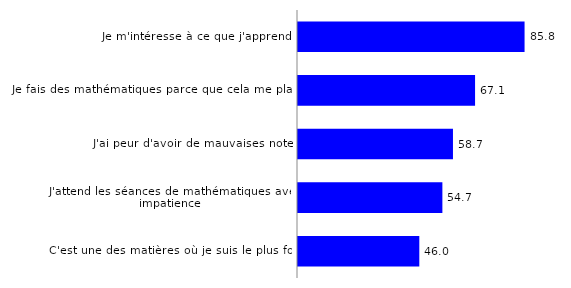
| Category | Series 0 |
|---|---|
| C'est une des matières où je suis le plus fort | 45.95 |
| J'attend les séances de mathématiques avec impatience | 54.69 |
| J'ai peur d'avoir de mauvaises notes | 58.7 |
| Je fais des mathématiques parce que cela me plaît  | 67.07 |
| Je m'intéresse à ce que j'apprends | 85.82 |